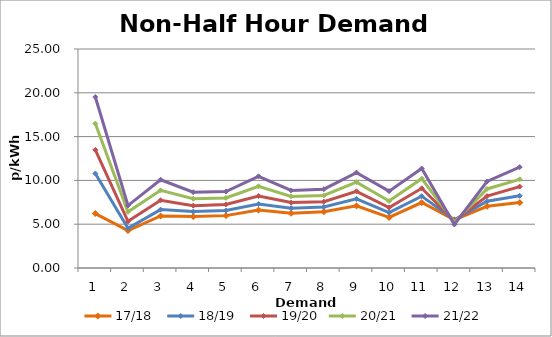
| Category | 17/18  | 18/19  | 19/20 | 20/21  | 21/22  |
|---|---|---|---|---|---|
| 1.0 | 6.216 | 10.782 | 13.489 | 16.484 | 19.515 |
| 2.0 | 4.263 | 4.533 | 5.326 | 6.41 | 7.128 |
| 3.0 | 5.943 | 6.665 | 7.733 | 8.864 | 10.077 |
| 4.0 | 5.878 | 6.437 | 7.118 | 7.905 | 8.648 |
| 5.0 | 5.979 | 6.563 | 7.249 | 7.997 | 8.731 |
| 6.0 | 6.607 | 7.303 | 8.22 | 9.33 | 10.464 |
| 7.0 | 6.249 | 6.833 | 7.467 | 8.174 | 8.854 |
| 8.0 | 6.426 | 6.963 | 7.574 | 8.283 | 8.995 |
| 9.0 | 7.095 | 7.889 | 8.755 | 9.8 | 10.89 |
| 10.0 | 5.775 | 6.318 | 6.902 | 7.643 | 8.776 |
| 11.0 | 7.475 | 8.201 | 9.102 | 10.198 | 11.357 |
| 12.0 | 5.487 | 5.496 | 5.366 | 5.228 | 4.973 |
| 13.0 | 7.048 | 7.623 | 8.214 | 9.024 | 9.875 |
| 14.0 | 7.465 | 8.24 | 9.289 | 10.122 | 11.519 |